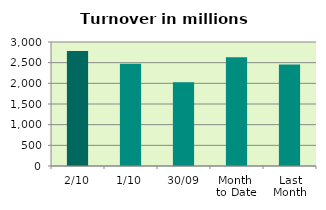
| Category | Series 0 |
|---|---|
| 2/10 | 2784.276 |
| 1/10 | 2475.076 |
| 30/09 | 2027.614 |
| Month 
to Date | 2629.676 |
| Last
Month | 2458.207 |